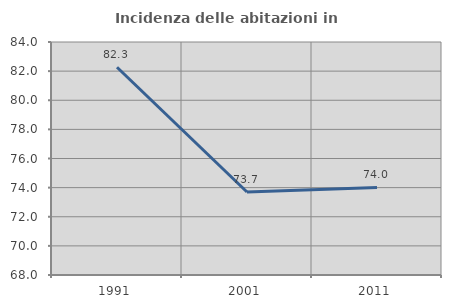
| Category | Incidenza delle abitazioni in proprietà  |
|---|---|
| 1991.0 | 82.264 |
| 2001.0 | 73.702 |
| 2011.0 | 74.011 |